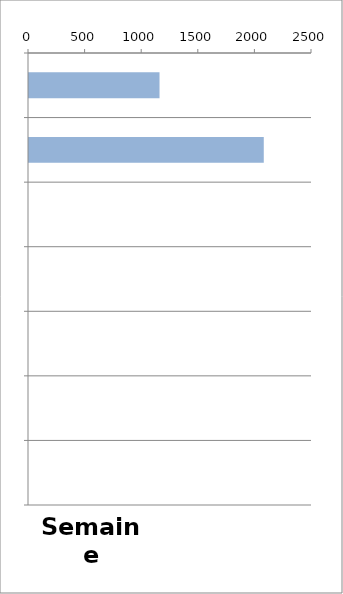
| Category | TV |
|---|---|
| 0 | 1153 |
| 1 | 2074 |
| 2 | 0 |
| 3 | 0 |
| 4 | 0 |
| 5 | 0 |
| 6 | 0 |